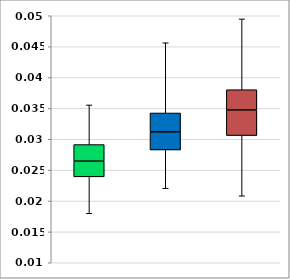
| Category | Series 0 | Series 1 | Series 2 | Series 3 |
|---|---|---|---|---|
| 0 | 0.018 | 0.006 | 0.003 | 0.003 |
| 1 | 0.022 | 0.006 | 0.003 | 0.003 |
| 2 | 0.021 | 0.01 | 0.004 | 0.003 |